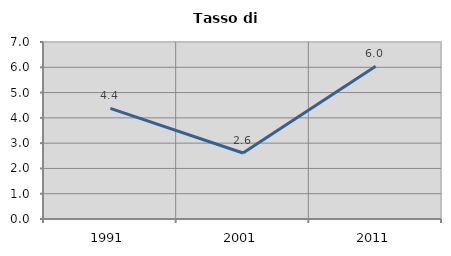
| Category | Tasso di disoccupazione   |
|---|---|
| 1991.0 | 4.372 |
| 2001.0 | 2.609 |
| 2011.0 | 6.045 |